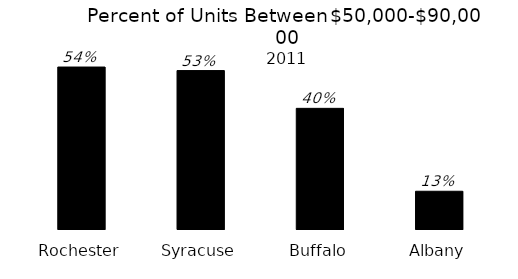
| Category | Series 0 |
|---|---|
| Rochester | 0.54 |
| Syracuse | 0.528 |
| Buffalo | 0.402 |
| Albany | 0.126 |